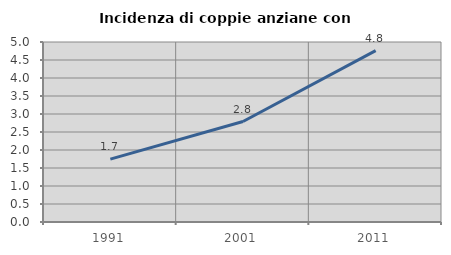
| Category | Incidenza di coppie anziane con figli |
|---|---|
| 1991.0 | 1.747 |
| 2001.0 | 2.791 |
| 2011.0 | 4.762 |